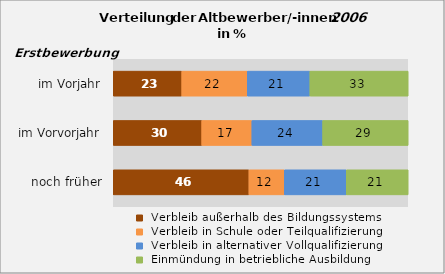
| Category |  Verbleib außerhalb des Bildungssystems |  Verbleib in Schule oder Teilqualifizierung |  Verbleib in alternativer Vollqualifizierung |  Einmündung in betriebliche Ausbildung |
|---|---|---|---|---|
|  noch früher | 46 | 12 | 21 | 21 |
|  im Vorvorjahr | 30 | 17 | 24 | 29 |
|  im Vorjahr | 23 | 22 | 21 | 33 |